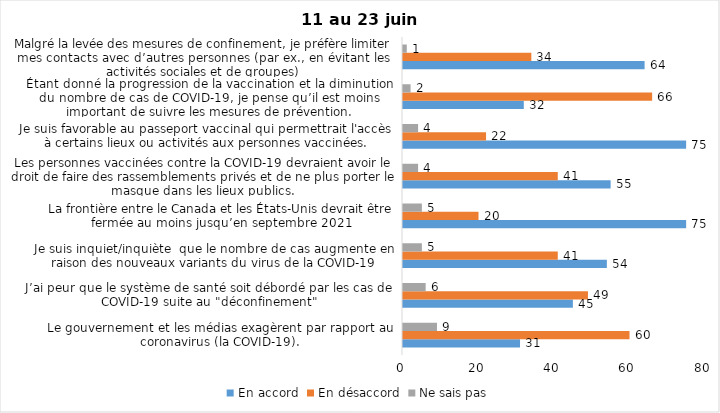
| Category | En accord | En désaccord | Ne sais pas |
|---|---|---|---|
| Le gouvernement et les médias exagèrent par rapport au coronavirus (la COVID-19). | 31 | 60 | 9 |
| J’ai peur que le système de santé soit débordé par les cas de COVID-19 suite au "déconfinement" | 45 | 49 | 6 |
| Je suis inquiet/inquiète  que le nombre de cas augmente en raison des nouveaux variants du virus de la COVID-19 | 54 | 41 | 5 |
| La frontière entre le Canada et les États-Unis devrait être fermée au moins jusqu’en septembre 2021 | 75 | 20 | 5 |
| Les personnes vaccinées contre la COVID-19 devraient avoir le droit de faire des rassemblements privés et de ne plus porter le masque dans les lieux publics. | 55 | 41 | 4 |
| Je suis favorable au passeport vaccinal qui permettrait l'accès à certains lieux ou activités aux personnes vaccinées. | 75 | 22 | 4 |
| Étant donné la progression de la vaccination et la diminution du nombre de cas de COVID-19, je pense qu’il est moins important de suivre les mesures de prévention. | 32 | 66 | 2 |
| Malgré la levée des mesures de confinement, je préfère limiter mes contacts avec d’autres personnes (par ex., en évitant les activités sociales et de groupes) | 64 | 34 | 1 |